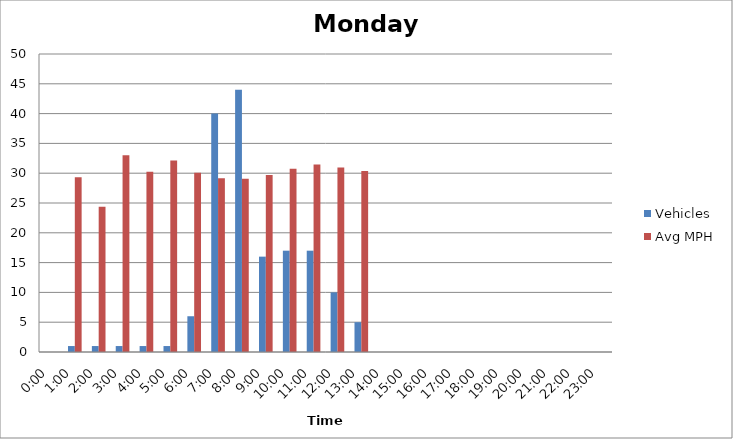
| Category | Vehicles | Avg MPH |
|---|---|---|
| 0:00 | 0 | 0 |
| 1:00 | 1 | 29.33 |
| 2:00 | 1 | 24.36 |
| 3:00 | 1 | 33 |
| 4:00 | 1 | 30.26 |
| 5:00 | 1 | 32.14 |
| 6:00 | 6 | 30.08 |
| 7:00 | 40 | 29.16 |
| 8:00 | 44 | 29.06 |
| 9:00 | 16 | 29.68 |
| 10:00 | 17 | 30.76 |
| 11:00 | 17 | 31.46 |
| 12:00 | 10 | 30.96 |
| 13:00 | 5 | 30.36 |
| 14:00 | 0 | 0 |
| 15:00 | 0 | 0 |
| 16:00 | 0 | 0 |
| 17:00 | 0 | 0 |
| 18:00 | 0 | 0 |
| 19:00 | 0 | 0 |
| 20:00 | 0 | 0 |
| 21:00 | 0 | 0 |
| 22:00 | 0 | 0 |
| 23:00 | 0 | 0 |